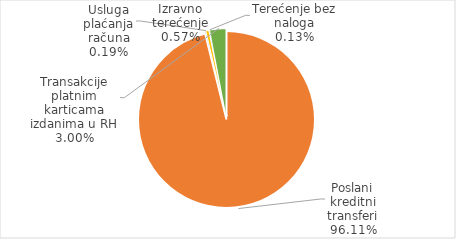
| Category | Ukupno | Series 1 |
|---|---|---|
|  | 0 |  |
| Poslani kreditni transferi | 2242048903642 |  |
| Usluga plaćanja računa | 4478590913 |  |
| Izravno terećenje | 13274336766 |  |
| Terećenje bez naloga | 2962746537 |  |
| Transakcije platnim karticama izdanima u RH | 69949173180 |  |